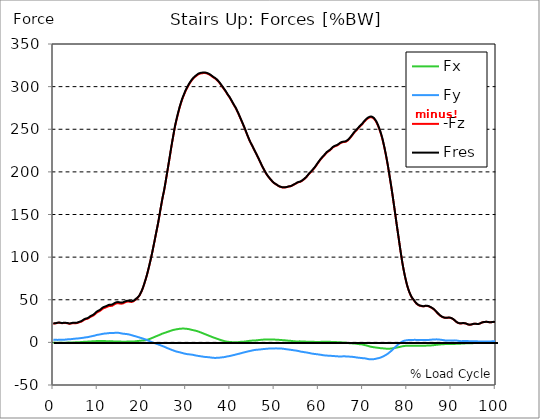
| Category |  Fx |  Fy |  -Fz |  Fres |
|---|---|---|---|---|
| 0.0 | -0.345 | 3.009 | 22.266 | 22.483 |
| 0.167348456675344 | -0.381 | 2.964 | 22.252 | 22.463 |
| 0.334696913350688 | -0.391 | 2.935 | 22.214 | 22.423 |
| 0.5020453700260321 | -0.388 | 2.917 | 22.174 | 22.381 |
| 0.669393826701376 | -0.377 | 2.942 | 22.462 | 22.668 |
| 0.83674228337672 | -0.383 | 2.92 | 22.723 | 22.926 |
| 1.0040907400520642 | -0.387 | 2.921 | 22.924 | 23.129 |
| 1.1621420602454444 | -0.378 | 2.964 | 23.04 | 23.249 |
| 1.3294905169207885 | -0.373 | 2.997 | 23.046 | 23.259 |
| 1.4968389735961325 | -0.39 | 3.006 | 22.915 | 23.129 |
| 1.6641874302714765 | -0.436 | 2.981 | 22.716 | 22.929 |
| 1.8315358869468206 | -0.488 | 2.938 | 22.507 | 22.717 |
| 1.9988843436221646 | -0.495 | 2.937 | 22.483 | 22.694 |
| 2.1662328002975086 | -0.484 | 3.004 | 22.606 | 22.827 |
| 2.333581256972853 | -0.474 | 3.076 | 22.739 | 22.97 |
| 2.5009297136481967 | -0.439 | 3.152 | 22.83 | 23.071 |
| 2.6682781703235405 | -0.414 | 3.228 | 22.769 | 23.021 |
| 2.8356266269988843 | -0.375 | 3.324 | 22.685 | 22.951 |
| 3.002975083674229 | -0.333 | 3.43 | 22.551 | 22.827 |
| 3.1703235403495724 | -0.27 | 3.57 | 22.457 | 22.752 |
| 3.337671997024917 | -0.263 | 3.6 | 22.237 | 22.542 |
| 3.4957233172182973 | -0.276 | 3.606 | 21.965 | 22.272 |
| 3.663071773893641 | -0.279 | 3.634 | 21.788 | 22.102 |
| 3.8304202305689854 | -0.244 | 3.702 | 21.933 | 22.257 |
| 3.997768687244329 | -0.209 | 3.775 | 22.174 | 22.507 |
| 4.165117143919673 | -0.172 | 3.858 | 22.394 | 22.737 |
| 4.332465600595017 | -0.13 | 3.969 | 22.555 | 22.914 |
| 4.499814057270361 | -0.089 | 4.081 | 22.632 | 23.009 |
| 4.667162513945706 | -0.058 | 4.228 | 22.581 | 22.986 |
| 4.834510970621049 | -0.028 | 4.324 | 22.489 | 22.916 |
| 5.001859427296393 | 0.001 | 4.391 | 22.421 | 22.863 |
| 5.169207883971737 | 0.031 | 4.466 | 22.499 | 22.954 |
| 5.336556340647081 | 0.061 | 4.498 | 22.641 | 23.099 |
| 5.503904797322425 | 0.092 | 4.551 | 22.884 | 23.347 |
| 5.671253253997769 | 0.152 | 4.675 | 23.232 | 23.714 |
| 5.82930457419115 | 0.225 | 4.809 | 23.608 | 24.107 |
| 5.996653030866494 | 0.275 | 4.907 | 23.839 | 24.352 |
| 6.164001487541838 | 0.32 | 5.003 | 24.043 | 24.569 |
| 6.331349944217181 | 0.368 | 5.094 | 24.368 | 24.906 |
| 6.498698400892526 | 0.453 | 5.191 | 24.923 | 25.47 |
| 6.66604685756787 | 0.543 | 5.323 | 25.523 | 26.084 |
| 6.833395314243213 | 0.634 | 5.454 | 26.106 | 26.685 |
| 7.000743770918558 | 0.72 | 5.615 | 26.632 | 27.235 |
| 7.168092227593902 | 0.783 | 5.772 | 27.017 | 27.645 |
| 7.335440684269246 | 0.817 | 5.894 | 27.255 | 27.906 |
| 7.50278914094459 | 0.837 | 5.978 | 27.432 | 28.095 |
| 7.6701375976199335 | 0.858 | 6.065 | 27.634 | 28.312 |
| 7.837486054295278 | 0.903 | 6.201 | 28.009 | 28.71 |
| 7.995537374488658 | 0.96 | 6.377 | 28.515 | 29.245 |
| 8.162885831164003 | 1.014 | 6.579 | 29.12 | 29.881 |
| 8.330234287839346 | 1.108 | 6.832 | 29.8 | 30.601 |
| 8.49758274451469 | 1.166 | 7.045 | 30.292 | 31.129 |
| 8.664931201190035 | 1.182 | 7.209 | 30.643 | 31.51 |
| 8.832279657865378 | 1.194 | 7.361 | 30.973 | 31.866 |
| 8.999628114540721 | 1.225 | 7.528 | 31.401 | 32.323 |
| 9.166976571216066 | 1.281 | 7.706 | 31.986 | 32.934 |
| 9.334325027891412 | 1.355 | 7.954 | 32.755 | 33.742 |
| 9.501673484566755 | 1.431 | 8.228 | 33.588 | 34.618 |
| 9.669021941242098 | 1.492 | 8.479 | 34.372 | 35.44 |
| 9.836370397917442 | 1.525 | 8.698 | 35.027 | 36.13 |
| 10.003718854592787 | 1.554 | 8.893 | 35.565 | 36.699 |
| 10.17106731126813 | 1.555 | 9.022 | 35.965 | 37.119 |
| 10.329118631461512 | 1.534 | 9.138 | 36.372 | 37.541 |
| 10.496467088136853 | 1.52 | 9.267 | 36.831 | 38.018 |
| 10.663815544812199 | 1.503 | 9.437 | 37.44 | 38.649 |
| 10.831164001487544 | 1.506 | 9.627 | 38.151 | 39.383 |
| 10.998512458162887 | 1.523 | 9.821 | 38.917 | 40.175 |
| 11.16586091483823 | 1.543 | 10.01 | 39.627 | 40.91 |
| 11.333209371513574 | 1.56 | 10.169 | 40.114 | 41.421 |
| 11.50055782818892 | 1.555 | 10.303 | 40.481 | 41.81 |
| 11.667906284864264 | 1.502 | 10.378 | 40.643 | 41.982 |
| 11.835254741539607 | 1.449 | 10.436 | 40.855 | 42.201 |
| 12.00260319821495 | 1.423 | 10.511 | 41.324 | 42.672 |
| 12.169951654890292 | 1.417 | 10.594 | 41.781 | 43.135 |
| 12.337300111565641 | 1.435 | 10.714 | 42.181 | 43.552 |
| 12.504648568240984 | 1.455 | 10.831 | 42.55 | 43.938 |
| 12.662699888434362 | 1.467 | 10.916 | 42.729 | 44.133 |
| 12.830048345109708 | 1.437 | 10.948 | 42.795 | 44.203 |
| 12.997396801785053 | 1.364 | 10.917 | 42.754 | 44.152 |
| 13.164745258460396 | 1.279 | 10.875 | 42.741 | 44.125 |
| 13.33209371513574 | 1.223 | 10.912 | 43.052 | 44.434 |
| 13.499442171811083 | 1.17 | 10.975 | 43.511 | 44.893 |
| 13.666790628486426 | 1.128 | 11.062 | 44.154 | 45.535 |
| 13.834139085161771 | 1.108 | 11.169 | 44.738 | 46.128 |
| 14.001487541837117 | 1.083 | 11.237 | 45.19 | 46.582 |
| 14.16883599851246 | 1.066 | 11.288 | 45.547 | 46.939 |
| 14.336184455187803 | 1.074 | 11.323 | 45.783 | 47.177 |
| 14.503532911863147 | 1.088 | 11.308 | 45.893 | 47.28 |
| 14.670881368538492 | 1.076 | 11.241 | 45.874 | 47.245 |
| 14.828932688731873 | 1.043 | 11.126 | 45.77 | 47.117 |
| 14.996281145407215 | 0.997 | 10.974 | 45.575 | 46.892 |
| 15.163629602082558 | 0.946 | 10.785 | 45.418 | 46.695 |
| 15.330978058757903 | 0.888 | 10.591 | 45.385 | 46.619 |
| 15.498326515433247 | 0.832 | 10.414 | 45.43 | 46.625 |
| 15.665674972108594 | 0.785 | 10.259 | 45.555 | 46.712 |
| 15.833023428783937 | 0.782 | 10.143 | 45.954 | 47.079 |
| 16.00037188545928 | 0.774 | 10.052 | 46.412 | 47.51 |
| 16.167720342134626 | 0.781 | 9.96 | 46.858 | 47.929 |
| 16.335068798809967 | 0.818 | 9.894 | 47.27 | 48.32 |
| 16.502417255485312 | 0.865 | 9.797 | 47.59 | 48.617 |
| 16.669765712160658 | 0.906 | 9.692 | 47.774 | 48.779 |
| 16.837114168836 | 0.968 | 9.575 | 47.868 | 48.85 |
| 17.004462625511344 | 1.006 | 9.422 | 47.872 | 48.826 |
| 17.16251394570472 | 1.027 | 9.231 | 47.775 | 48.695 |
| 17.32986240238007 | 0.997 | 9.004 | 47.572 | 48.449 |
| 17.497210859055414 | 0.964 | 8.746 | 47.419 | 48.248 |
| 17.664559315730756 | 0.977 | 8.483 | 47.443 | 48.222 |
| 17.8319077724061 | 0.999 | 8.21 | 47.581 | 48.31 |
| 17.999256229081443 | 1.031 | 7.939 | 47.915 | 48.596 |
| 18.166604685756788 | 1.068 | 7.679 | 48.387 | 49.022 |
| 18.333953142432133 | 1.106 | 7.432 | 48.988 | 49.578 |
| 18.501301599107478 | 1.182 | 7.206 | 49.742 | 50.293 |
| 18.668650055782823 | 1.311 | 7.031 | 50.573 | 51.088 |
| 18.835998512458165 | 1.445 | 6.737 | 51.21 | 51.683 |
| 19.00334696913351 | 1.573 | 6.436 | 51.907 | 52.342 |
| 19.170695425808855 | 1.681 | 6.173 | 52.812 | 53.213 |
| 19.338043882484197 | 1.75 | 5.92 | 53.961 | 54.33 |
| 19.496095202677576 | 1.81 | 5.655 | 55.255 | 55.59 |
| 19.66344365935292 | 1.906 | 5.405 | 56.822 | 57.126 |
| 19.830792116028263 | 2.004 | 5.145 | 58.622 | 58.899 |
| 19.998140572703612 | 2.11 | 4.893 | 60.563 | 60.817 |
| 20.165489029378953 | 2.205 | 4.639 | 62.725 | 62.955 |
| 20.3328374860543 | 2.289 | 4.346 | 65.152 | 65.359 |
| 20.500185942729644 | 2.395 | 4.049 | 67.781 | 67.964 |
| 20.667534399404985 | 2.525 | 3.746 | 70.535 | 70.703 |
| 20.83488285608033 | 2.663 | 3.428 | 73.307 | 73.461 |
| 21.002231312755672 | 2.822 | 3.092 | 76.145 | 76.284 |
| 21.16957976943102 | 3.04 | 2.745 | 79.315 | 79.446 |
| 21.336928226106362 | 3.268 | 2.387 | 82.596 | 82.72 |
| 21.504276682781704 | 3.519 | 2.015 | 86.032 | 86.15 |
| 21.67162513945705 | 3.813 | 1.637 | 89.694 | 89.813 |
| 21.82967645965043 | 4.134 | 1.253 | 93.365 | 93.488 |
| 21.997024916325774 | 4.458 | 0.868 | 97.057 | 97.186 |
| 22.16437337300112 | 4.787 | 0.49 | 100.872 | 101.008 |
| 22.33172182967646 | 5.146 | 0.129 | 104.902 | 105.049 |
| 22.499070286351806 | 5.52 | -0.195 | 109.133 | 109.292 |
| 22.666418743027148 | 5.885 | -0.499 | 113.43 | 113.604 |
| 22.833767199702496 | 6.254 | -0.779 | 117.626 | 117.814 |
| 23.00111565637784 | 6.637 | -1.077 | 121.978 | 122.183 |
| 23.168464113053183 | 7.015 | -1.394 | 126.409 | 126.628 |
| 23.335812569728528 | 7.373 | -1.684 | 130.748 | 130.985 |
| 23.50316102640387 | 7.701 | -2.003 | 135.119 | 135.369 |
| 23.670509483079215 | 8.026 | -2.329 | 139.401 | 139.667 |
| 23.83785793975456 | 8.396 | -2.637 | 144.243 | 144.526 |
| 23.995909259947936 | 8.752 | -2.938 | 149.234 | 149.533 |
| 24.163257716623285 | 9.173 | -3.284 | 154.326 | 154.648 |
| 24.330606173298627 | 9.559 | -3.617 | 159.219 | 159.56 |
| 24.49795462997397 | 9.945 | -3.957 | 164.055 | 164.415 |
| 24.665303086649313 | 10.323 | -4.293 | 168.794 | 169.175 |
| 24.83265154332466 | 10.613 | -4.612 | 173.004 | 173.401 |
| 25.0 | 10.872 | -4.925 | 176.977 | 177.391 |
| 25.167348456675345 | 11.164 | -5.317 | 181.721 | 182.154 |
| 25.334696913350694 | 11.455 | -5.721 | 186.674 | 187.124 |
| 25.502045370026035 | 11.764 | -6.138 | 191.852 | 192.321 |
| 25.669393826701377 | 12.061 | -6.524 | 197.014 | 197.502 |
| 25.836742283376722 | 12.35 | -6.88 | 202.206 | 202.711 |
| 26.004090740052067 | 12.64 | -7.23 | 207.45 | 207.973 |
| 26.17143919672741 | 12.937 | -7.581 | 212.728 | 213.267 |
| 26.329490516920792 | 13.237 | -7.921 | 218.013 | 218.57 |
| 26.49683897359613 | 13.547 | -8.272 | 223.44 | 224.014 |
| 26.66418743027148 | 13.844 | -8.591 | 228.705 | 229.295 |
| 26.831535886946828 | 14.121 | -8.911 | 233.839 | 234.445 |
| 26.998884343622166 | 14.378 | -9.241 | 238.752 | 239.373 |
| 27.166232800297514 | 14.625 | -9.569 | 243.606 | 244.243 |
| 27.333581256972852 | 14.832 | -9.892 | 248.443 | 249.09 |
| 27.5009297136482 | 15.003 | -10.196 | 253.046 | 253.705 |
| 27.668278170323543 | 15.161 | -10.493 | 256.996 | 257.666 |
| 27.835626626998888 | 15.288 | -10.778 | 260.774 | 261.453 |
| 28.002975083674233 | 15.452 | -11.013 | 264.394 | 265.081 |
| 28.170323540349575 | 15.605 | -11.181 | 267.839 | 268.534 |
| 28.33767199702492 | 15.76 | -11.347 | 271.217 | 271.919 |
| 28.50502045370026 | 15.917 | -11.548 | 274.477 | 275.19 |
| 28.663071773893645 | 16.032 | -11.769 | 277.521 | 278.241 |
| 28.830420230568986 | 16.086 | -11.995 | 280.323 | 281.048 |
| 28.99776868724433 | 16.12 | -12.221 | 283.017 | 283.748 |
| 29.165117143919673 | 16.165 | -12.475 | 285.551 | 286.289 |
| 29.33246560059502 | 16.179 | -12.72 | 287.839 | 288.582 |
| 29.499814057270367 | 16.143 | -12.93 | 289.926 | 290.672 |
| 29.66716251394571 | 16.121 | -13.17 | 292.105 | 292.854 |
| 29.834510970621054 | 16.097 | -13.396 | 294.166 | 294.92 |
| 30.00185942729639 | 16.022 | -13.557 | 296.026 | 296.779 |
| 30.169207883971744 | 15.89 | -13.693 | 297.708 | 298.457 |
| 30.33655634064708 | 15.772 | -13.831 | 299.361 | 300.107 |
| 30.50390479732243 | 15.667 | -13.924 | 300.963 | 301.703 |
| 30.671253253997772 | 15.495 | -14.017 | 302.516 | 303.25 |
| 30.829304574191156 | 15.28 | -14.105 | 303.925 | 304.649 |
| 30.996653030866494 | 15.067 | -14.209 | 305.241 | 305.956 |
| 31.164001487541842 | 14.857 | -14.32 | 306.485 | 307.194 |
| 31.331349944217187 | 14.645 | -14.432 | 307.671 | 308.372 |
| 31.498698400892525 | 14.449 | -14.573 | 308.766 | 309.463 |
| 31.666046857567874 | 14.263 | -14.746 | 309.733 | 310.427 |
| 31.833395314243212 | 14.092 | -14.95 | 310.568 | 311.263 |
| 32.00074377091856 | 13.915 | -15.148 | 311.337 | 312.035 |
| 32.1680922275939 | 13.69 | -15.345 | 312.046 | 312.743 |
| 32.33544068426925 | 13.448 | -15.511 | 312.741 | 313.435 |
| 32.50278914094459 | 13.203 | -15.672 | 313.436 | 314.126 |
| 32.670137597619934 | 12.92 | -15.817 | 314.098 | 314.782 |
| 32.83748605429528 | 12.579 | -15.929 | 314.605 | 315.281 |
| 33.004834510970625 | 12.281 | -16.074 | 315.015 | 315.686 |
| 33.162885831164004 | 11.99 | -16.243 | 315.293 | 315.961 |
| 33.33023428783935 | 11.662 | -16.35 | 315.489 | 316.151 |
| 33.497582744514695 | 11.319 | -16.43 | 315.658 | 316.311 |
| 33.664931201190036 | 10.965 | -16.591 | 315.764 | 316.414 |
| 33.83227965786538 | 10.609 | -16.754 | 315.855 | 316.506 |
| 33.99962811454073 | 10.257 | -16.895 | 315.914 | 316.559 |
| 34.16697657121607 | 9.91 | -17.044 | 315.939 | 316.582 |
| 34.33432502789141 | 9.568 | -17.13 | 315.912 | 316.548 |
| 34.50167348456676 | 9.223 | -17.178 | 315.765 | 316.395 |
| 34.6690219412421 | 8.894 | -17.277 | 315.502 | 316.128 |
| 34.83637039791744 | 8.547 | -17.314 | 315.218 | 315.834 |
| 35.00371885459279 | 8.175 | -17.333 | 314.854 | 315.462 |
| 35.17106731126814 | 7.852 | -17.415 | 314.436 | 315.041 |
| 35.338415767943474 | 7.505 | -17.548 | 313.951 | 314.556 |
| 35.49646708813686 | 7.186 | -17.674 | 313.392 | 313.997 |
| 35.6638155448122 | 6.797 | -17.794 | 312.803 | 313.408 |
| 35.831164001487544 | 6.425 | -17.897 | 312.179 | 312.783 |
| 35.998512458162885 | 6.108 | -18.037 | 311.459 | 312.07 |
| 36.165860914838234 | 5.806 | -18.121 | 310.792 | 311.403 |
| 36.333209371513576 | 5.499 | -18.173 | 310.263 | 310.872 |
| 36.50055782818892 | 5.201 | -18.21 | 309.756 | 310.363 |
| 36.667906284864266 | 4.916 | -18.232 | 309.177 | 309.781 |
| 36.83525474153961 | 4.618 | -18.197 | 308.445 | 309.045 |
| 37.002603198214956 | 4.257 | -18.117 | 307.662 | 308.253 |
| 37.1699516548903 | 3.956 | -18.062 | 306.823 | 307.409 |
| 37.337300111565646 | 3.65 | -17.99 | 305.849 | 306.428 |
| 37.50464856824098 | 3.352 | -17.945 | 304.779 | 305.355 |
| 37.66269988843437 | 3.031 | -17.876 | 303.679 | 304.248 |
| 37.83004834510971 | 2.76 | -17.752 | 302.514 | 303.075 |
| 37.99739680178505 | 2.517 | -17.643 | 301.312 | 301.867 |
| 38.16474525846039 | 2.266 | -17.55 | 300.055 | 300.604 |
| 38.33209371513574 | 2 | -17.465 | 298.839 | 299.382 |
| 38.49944217181109 | 1.703 | -17.386 | 297.631 | 298.169 |
| 38.666790628486424 | 1.44 | -17.243 | 296.45 | 296.982 |
| 38.83413908516178 | 1.187 | -17.062 | 295.323 | 295.845 |
| 39.001487541837115 | 1.019 | -16.861 | 293.986 | 294.498 |
| 39.16883599851246 | 0.853 | -16.625 | 292.603 | 293.103 |
| 39.336184455187805 | 0.786 | -16.45 | 291.126 | 291.619 |
| 39.503532911863154 | 0.667 | -16.317 | 289.825 | 290.312 |
| 39.670881368538495 | 0.552 | -16.212 | 288.635 | 289.119 |
| 39.83822982521384 | 0.461 | -16.072 | 287.354 | 287.832 |
| 39.996281145407224 | 0.409 | -15.876 | 285.917 | 286.388 |
| 40.163629602082565 | 0.373 | -15.695 | 284.392 | 284.855 |
| 40.33097805875791 | 0.308 | -15.436 | 282.895 | 283.348 |
| 40.498326515433256 | 0.237 | -15.213 | 281.335 | 281.778 |
| 40.6656749721086 | 0.174 | -15.023 | 279.795 | 280.23 |
| 40.83302342878393 | 0.138 | -14.837 | 278.244 | 278.67 |
| 41.00037188545929 | 0.123 | -14.619 | 276.8 | 277.217 |
| 41.16772034213463 | 0.125 | -14.383 | 275.443 | 275.849 |
| 41.33506879880997 | 0.146 | -14.123 | 273.772 | 274.165 |
| 41.50241725548531 | 0.182 | -13.899 | 271.973 | 272.357 |
| 41.66976571216066 | 0.21 | -13.717 | 270.155 | 270.533 |
| 41.837114168836 | 0.266 | -13.525 | 268.317 | 268.688 |
| 42.004462625511344 | 0.39 | -13.314 | 266.342 | 266.706 |
| 42.17181108218669 | 0.525 | -13.098 | 264.348 | 264.703 |
| 42.32986240238007 | 0.643 | -12.868 | 262.323 | 262.668 |
| 42.497210859055414 | 0.714 | -12.625 | 260.306 | 260.641 |
| 42.66455931573076 | 0.754 | -12.369 | 258.31 | 258.635 |
| 42.831907772406105 | 0.786 | -12.124 | 256.33 | 256.646 |
| 42.999256229081446 | 0.828 | -11.905 | 254.254 | 254.563 |
| 43.16660468575679 | 0.875 | -11.676 | 252.143 | 252.443 |
| 43.33395314243214 | 0.963 | -11.459 | 249.994 | 250.285 |
| 43.50130159910748 | 1.081 | -11.249 | 247.813 | 248.098 |
| 43.66865005578282 | 1.244 | -11.043 | 245.517 | 245.795 |
| 43.83599851245817 | 1.41 | -10.839 | 243.325 | 243.597 |
| 44.00334696913351 | 1.545 | -10.627 | 241.199 | 241.463 |
| 44.17069542580886 | 1.652 | -10.415 | 239.105 | 239.364 |
| 44.3380438824842 | 1.773 | -10.23 | 237.05 | 237.305 |
| 44.49609520267758 | 1.924 | -10.052 | 235.119 | 235.369 |
| 44.66344365935292 | 2.027 | -9.88 | 233.383 | 233.63 |
| 44.83079211602827 | 2.063 | -9.683 | 231.837 | 232.079 |
| 44.99814057270361 | 2.065 | -9.461 | 230.231 | 230.465 |
| 45.16548902937895 | 2.092 | -9.261 | 228.441 | 228.668 |
| 45.332837486054295 | 2.115 | -9.094 | 226.658 | 226.88 |
| 45.500185942729644 | 2.142 | -8.948 | 224.915 | 225.133 |
| 45.66753439940499 | 2.212 | -8.832 | 223.231 | 223.448 |
| 45.83488285608033 | 2.325 | -8.747 | 221.585 | 221.801 |
| 46.00223131275568 | 2.441 | -8.67 | 219.843 | 220.059 |
| 46.16957976943102 | 2.555 | -8.597 | 218.031 | 218.249 |
| 46.336928226106366 | 2.643 | -8.499 | 216.221 | 216.437 |
| 46.50427668278171 | 2.733 | -8.419 | 214.422 | 214.636 |
| 46.671625139457056 | 2.828 | -8.328 | 212.599 | 212.813 |
| 46.829676459650436 | 2.928 | -8.246 | 210.781 | 210.994 |
| 46.99702491632577 | 3.034 | -8.147 | 208.884 | 209.095 |
| 47.16437337300112 | 3.106 | -8.044 | 207.085 | 207.294 |
| 47.33172182967646 | 3.168 | -7.928 | 205.379 | 205.586 |
| 47.49907028635181 | 3.228 | -7.863 | 203.737 | 203.941 |
| 47.66641874302716 | 3.303 | -7.806 | 202.141 | 202.345 |
| 47.83376719970249 | 3.366 | -7.712 | 200.563 | 200.765 |
| 48.001115656377834 | 3.419 | -7.608 | 198.985 | 199.185 |
| 48.16846411305319 | 3.453 | -7.521 | 197.529 | 197.726 |
| 48.33581256972853 | 3.453 | -7.436 | 196.212 | 196.406 |
| 48.50316102640387 | 3.431 | -7.355 | 194.988 | 195.181 |
| 48.67050948307921 | 3.408 | -7.299 | 193.906 | 194.095 |
| 48.837857939754564 | 3.395 | -7.249 | 192.844 | 193.032 |
| 49.005206396429905 | 3.373 | -7.175 | 191.745 | 191.93 |
| 49.163257716623285 | 3.361 | -7.146 | 190.746 | 190.93 |
| 49.33060617329863 | 3.382 | -7.132 | 189.732 | 189.916 |
| 49.49795462997397 | 3.386 | -7.125 | 188.785 | 188.97 |
| 49.66530308664932 | 3.378 | -7.116 | 187.951 | 188.137 |
| 49.832651543324666 | 3.37 | -7.099 | 187.139 | 187.324 |
| 50.0 | 3.33 | -7.076 | 186.414 | 186.599 |
| 50.16734845667534 | 3.234 | -7.041 | 185.883 | 186.062 |
| 50.33469691335069 | 3.135 | -7.022 | 185.386 | 185.561 |
| 50.50204537002604 | 3.083 | -7.048 | 184.865 | 185.039 |
| 50.66939382670139 | 3.058 | -7.079 | 184.226 | 184.403 |
| 50.836742283376715 | 3.025 | -7.119 | 183.666 | 183.844 |
| 51.00409074005207 | 2.978 | -7.124 | 183.081 | 183.259 |
| 51.17143919672741 | 2.871 | -7.124 | 182.715 | 182.892 |
| 51.32949051692079 | 2.782 | -7.169 | 182.488 | 182.665 |
| 51.496838973596134 | 2.717 | -7.221 | 182.214 | 182.392 |
| 51.66418743027148 | 2.677 | -7.302 | 181.933 | 182.115 |
| 51.831535886946824 | 2.631 | -7.387 | 181.684 | 181.868 |
| 51.99888434362217 | 2.542 | -7.495 | 181.677 | 181.866 |
| 52.16623280029752 | 2.446 | -7.625 | 181.756 | 181.948 |
| 52.33358125697285 | 2.405 | -7.774 | 181.797 | 181.997 |
| 52.5009297136482 | 2.368 | -7.925 | 181.837 | 182.044 |
| 52.668278170323546 | 2.265 | -8.046 | 181.956 | 182.166 |
| 52.835626626998895 | 2.107 | -8.137 | 182.159 | 182.372 |
| 53.00297508367424 | 2.034 | -8.246 | 182.434 | 182.65 |
| 53.17032354034958 | 1.972 | -8.359 | 182.711 | 182.932 |
| 53.33767199702492 | 1.952 | -8.476 | 182.883 | 183.11 |
| 53.50502045370027 | 1.903 | -8.61 | 182.934 | 183.168 |
| 53.663071773893655 | 1.821 | -8.743 | 183.057 | 183.295 |
| 53.83042023056899 | 1.653 | -8.84 | 183.457 | 183.699 |
| 53.99776868724433 | 1.539 | -8.952 | 183.943 | 184.191 |
| 54.16511714391967 | 1.454 | -9.08 | 184.434 | 184.688 |
| 54.33246560059503 | 1.408 | -9.228 | 184.941 | 185.203 |
| 54.49981405727037 | 1.315 | -9.368 | 185.375 | 185.644 |
| 54.667162513945705 | 1.203 | -9.49 | 185.769 | 186.043 |
| 54.834510970621054 | 1.124 | -9.6 | 186.237 | 186.516 |
| 55.0018594272964 | 1.059 | -9.711 | 186.815 | 187.098 |
| 55.169207883971744 | 1.11 | -9.879 | 187.399 | 187.69 |
| 55.336556340647086 | 1.152 | -10.063 | 187.754 | 188.055 |
| 55.50390479732243 | 1.186 | -10.259 | 187.933 | 188.245 |
| 55.671253253997776 | 1.185 | -10.468 | 188.123 | 188.446 |
| 55.83860171067312 | 1.178 | -10.701 | 188.332 | 188.668 |
| 55.9966530308665 | 1.151 | -10.888 | 188.695 | 189.041 |
| 56.16400148754184 | 1.107 | -11.023 | 189.277 | 189.63 |
| 56.33134994421718 | 1.063 | -11.123 | 189.925 | 190.281 |
| 56.498698400892536 | 1.052 | -11.244 | 190.6 | 190.963 |
| 56.66604685756788 | 1.063 | -11.4 | 191.266 | 191.636 |
| 56.83339531424321 | 1.009 | -11.555 | 191.957 | 192.335 |
| 57.00074377091856 | 0.91 | -11.693 | 192.706 | 193.09 |
| 57.16809222759391 | 0.818 | -11.804 | 193.583 | 193.973 |
| 57.33544068426925 | 0.76 | -11.942 | 194.533 | 194.93 |
| 57.5027891409446 | 0.741 | -12.106 | 195.641 | 196.048 |
| 57.670137597619934 | 0.751 | -12.299 | 196.785 | 197.203 |
| 57.83748605429528 | 0.72 | -12.475 | 197.799 | 198.226 |
| 58.004834510970625 | 0.735 | -12.631 | 198.67 | 199.105 |
| 58.16288583116401 | 0.759 | -12.819 | 199.497 | 199.941 |
| 58.330234287839346 | 0.783 | -13.008 | 200.323 | 200.778 |
| 58.497582744514695 | 0.733 | -13.174 | 201.337 | 201.801 |
| 58.66493120119004 | 0.68 | -13.319 | 202.276 | 202.748 |
| 58.832279657865385 | 0.64 | -13.444 | 203.35 | 203.828 |
| 58.999628114540734 | 0.591 | -13.572 | 204.363 | 204.848 |
| 59.16697657121607 | 0.542 | -13.693 | 205.414 | 205.905 |
| 59.33432502789142 | 0.526 | -13.764 | 206.667 | 207.159 |
| 59.50167348456676 | 0.511 | -13.866 | 207.89 | 208.385 |
| 59.66902194124211 | 0.514 | -13.943 | 209.23 | 209.725 |
| 59.83637039791745 | 0.499 | -14.063 | 210.419 | 210.917 |
| 60.00371885459278 | 0.507 | -14.212 | 211.586 | 212.09 |
| 60.17106731126813 | 0.526 | -14.351 | 212.745 | 213.254 |
| 60.33841576794349 | 0.563 | -14.461 | 213.907 | 214.421 |
| 60.49646708813685 | 0.604 | -14.581 | 215.045 | 215.563 |
| 60.6638155448122 | 0.65 | -14.714 | 216.111 | 216.634 |
| 60.831164001487544 | 0.724 | -14.897 | 216.987 | 217.517 |
| 60.99851245816289 | 0.75 | -15.071 | 217.865 | 218.404 |
| 61.16586091483824 | 0.766 | -15.186 | 218.813 | 219.355 |
| 61.333209371513576 | 0.783 | -15.262 | 219.805 | 220.35 |
| 61.50055782818892 | 0.79 | -15.325 | 220.823 | 221.369 |
| 61.667906284864266 | 0.796 | -15.386 | 221.831 | 222.378 |
| 61.835254741539615 | 0.794 | -15.457 | 222.756 | 223.306 |
| 62.002603198214956 | 0.779 | -15.55 | 223.418 | 223.972 |
| 62.16995165489029 | 0.756 | -15.648 | 223.96 | 224.517 |
| 62.33730011156564 | 0.701 | -15.699 | 224.552 | 225.111 |
| 62.504648568240995 | 0.65 | -15.737 | 225.186 | 225.745 |
| 62.67199702491633 | 0.603 | -15.769 | 225.865 | 226.425 |
| 62.83004834510971 | 0.547 | -15.813 | 226.693 | 227.253 |
| 62.99739680178505 | 0.48 | -15.867 | 227.657 | 228.218 |
| 63.1647452584604 | 0.43 | -15.946 | 228.592 | 229.157 |
| 63.33209371513575 | 0.395 | -16.036 | 229.134 | 229.703 |
| 63.4994421718111 | 0.36 | -16.105 | 229.667 | 230.239 |
| 63.666790628486424 | 0.351 | -16.141 | 230 | 230.574 |
| 63.83413908516177 | 0.346 | -16.185 | 230.355 | 230.932 |
| 64.00148754183712 | 0.316 | -16.253 | 230.683 | 231.262 |
| 64.16883599851248 | 0.268 | -16.338 | 231.039 | 231.623 |
| 64.3361844551878 | 0.218 | -16.421 | 231.532 | 232.12 |
| 64.50353291186315 | 0.182 | -16.481 | 232.141 | 232.733 |
| 64.6708813685385 | 0.147 | -16.52 | 232.801 | 233.394 |
| 64.83822982521384 | 0.12 | -16.545 | 233.448 | 234.041 |
| 65.00557828188919 | 0.088 | -16.555 | 233.999 | 234.591 |
| 65.16362960208257 | -0.023 | -16.508 | 234.352 | 234.941 |
| 65.3309780587579 | -0.129 | -16.44 | 234.625 | 235.208 |
| 65.49832651543326 | -0.217 | -16.363 | 234.874 | 235.45 |
| 65.6656749721086 | -0.156 | -16.35 | 234.959 | 235.533 |
| 65.83302342878395 | -0.07 | -16.378 | 234.991 | 235.568 |
| 66.00037188545929 | -0.188 | -16.419 | 235.177 | 235.756 |
| 66.16772034213463 | -0.335 | -16.454 | 235.459 | 236.041 |
| 66.33506879880998 | -0.529 | -16.479 | 235.961 | 236.545 |
| 66.50241725548531 | -0.689 | -16.534 | 236.639 | 237.225 |
| 66.66976571216065 | -0.854 | -16.637 | 237.319 | 237.911 |
| 66.83711416883601 | -0.905 | -16.667 | 238.206 | 238.797 |
| 67.00446262551135 | -0.929 | -16.729 | 239.188 | 239.783 |
| 67.1718110821867 | -0.961 | -16.748 | 240.236 | 240.828 |
| 67.32986240238007 | -1.001 | -16.756 | 241.299 | 241.89 |
| 67.49721085905541 | -1.089 | -16.857 | 242.395 | 242.991 |
| 67.66455931573076 | -1.213 | -17.018 | 243.476 | 244.081 |
| 67.83190777240611 | -1.315 | -17.081 | 244.741 | 245.35 |
| 67.99925622908145 | -1.346 | -17.188 | 245.874 | 246.488 |
| 68.16660468575678 | -1.381 | -17.328 | 246.875 | 247.497 |
| 68.33395314243214 | -1.479 | -17.508 | 247.676 | 248.308 |
| 68.50130159910749 | -1.582 | -17.67 | 248.532 | 249.174 |
| 68.66865005578282 | -1.715 | -17.759 | 249.594 | 250.241 |
| 68.83599851245816 | -1.912 | -17.902 | 250.543 | 251.201 |
| 69.00334696913352 | -1.996 | -18.015 | 251.49 | 252.155 |
| 69.17069542580886 | -2.035 | -18.074 | 252.455 | 253.124 |
| 69.3380438824842 | -2.152 | -18.147 | 253.356 | 254.028 |
| 69.50539233915956 | -2.225 | -18.262 | 254.234 | 254.914 |
| 69.66344365935292 | -2.288 | -18.364 | 254.955 | 255.641 |
| 69.83079211602826 | -2.379 | -18.467 | 255.773 | 256.465 |
| 69.99814057270362 | -2.631 | -18.542 | 256.898 | 257.594 |
| 70.16548902937896 | -2.928 | -18.603 | 258.077 | 258.775 |
| 70.33283748605429 | -3.143 | -18.666 | 259.084 | 259.786 |
| 70.50018594272964 | -3.305 | -18.741 | 259.966 | 260.672 |
| 70.667534399405 | -3.479 | -18.915 | 260.791 | 261.507 |
| 70.83488285608033 | -3.714 | -19.151 | 261.657 | 262.388 |
| 71.00223131275568 | -3.952 | -19.369 | 262.399 | 263.146 |
| 71.16957976943102 | -4.199 | -19.566 | 263.01 | 263.773 |
| 71.33692822610637 | -4.457 | -19.697 | 263.495 | 264.271 |
| 71.50427668278171 | -4.729 | -19.761 | 263.858 | 264.641 |
| 71.67162513945706 | -4.981 | -19.814 | 264.151 | 264.942 |
| 71.8389735961324 | -5.155 | -19.826 | 264.163 | 264.957 |
| 71.99702491632577 | -5.302 | -19.854 | 263.975 | 264.775 |
| 72.16437337300113 | -5.459 | -19.865 | 263.63 | 264.435 |
| 72.33172182967647 | -5.595 | -19.781 | 263.061 | 263.863 |
| 72.49907028635181 | -5.735 | -19.65 | 262.28 | 263.079 |
| 72.66641874302715 | -5.872 | -19.51 | 261.311 | 262.106 |
| 72.8337671997025 | -5.999 | -19.337 | 260.046 | 260.835 |
| 73.00111565637783 | -6.117 | -19.137 | 258.594 | 259.374 |
| 73.16846411305319 | -6.213 | -18.907 | 256.915 | 257.686 |
| 73.33581256972853 | -6.312 | -18.689 | 254.999 | 255.763 |
| 73.50316102640387 | -6.44 | -18.514 | 252.863 | 253.623 |
| 73.67050948307921 | -6.573 | -18.329 | 250.654 | 251.412 |
| 73.83785793975457 | -6.71 | -18.098 | 248.293 | 249.044 |
| 74.00520639642991 | -6.814 | -17.785 | 245.637 | 246.377 |
| 74.16325771662328 | -6.889 | -17.419 | 242.786 | 243.51 |
| 74.33060617329863 | -6.951 | -17.027 | 239.697 | 240.404 |
| 74.49795462997398 | -6.995 | -16.609 | 236.248 | 236.937 |
| 74.66530308664932 | -7.071 | -16.188 | 232.492 | 233.165 |
| 74.83265154332466 | -7.152 | -15.757 | 228.595 | 229.252 |
| 75.00000000000001 | -7.248 | -15.292 | 224.495 | 225.137 |
| 75.16734845667534 | -7.335 | -14.804 | 220.199 | 220.822 |
| 75.3346969133507 | -7.427 | -14.286 | 215.667 | 216.272 |
| 75.50204537002605 | -7.499 | -13.743 | 210.982 | 211.568 |
| 75.66939382670138 | -7.52 | -13.129 | 206.035 | 206.595 |
| 75.83674228337672 | -7.476 | -12.426 | 200.757 | 201.286 |
| 76.00409074005208 | -7.41 | -11.693 | 195.392 | 195.889 |
| 76.17143919672742 | -7.332 | -10.983 | 190.013 | 190.48 |
| 76.33878765340276 | -7.249 | -10.28 | 184.663 | 185.098 |
| 76.49683897359614 | -7.135 | -9.517 | 179.102 | 179.505 |
| 76.66418743027148 | -7.009 | -8.716 | 173.315 | 173.683 |
| 76.83153588694682 | -6.877 | -7.897 | 167.326 | 167.663 |
| 76.99888434362218 | -6.719 | -7.044 | 161.221 | 161.525 |
| 77.16623280029752 | -6.563 | -6.203 | 155.223 | 155.493 |
| 77.33358125697285 | -6.395 | -5.397 | 149.09 | 149.335 |
| 77.5009297136482 | -6.221 | -4.59 | 142.901 | 143.121 |
| 77.66827817032356 | -6.045 | -3.795 | 136.809 | 137.005 |
| 77.83562662699889 | -5.874 | -3.03 | 130.857 | 131.035 |
| 78.00297508367423 | -5.688 | -2.301 | 124.91 | 125.074 |
| 78.17032354034959 | -5.492 | -1.591 | 118.966 | 119.117 |
| 78.33767199702493 | -5.293 | -0.876 | 112.914 | 113.053 |
| 78.50502045370027 | -5.072 | -0.23 | 106.972 | 107.106 |
| 78.67236891037561 | -4.859 | 0.356 | 101.241 | 101.373 |
| 78.83042023056899 | -4.683 | 0.867 | 95.806 | 95.937 |
| 78.99776868724433 | -4.53 | 1.307 | 90.643 | 90.774 |
| 79.16511714391969 | -4.388 | 1.64 | 85.93 | 86.067 |
| 79.33246560059503 | -4.257 | 1.923 | 81.501 | 81.644 |
| 79.49981405727036 | -4.142 | 2.15 | 77.435 | 77.585 |
| 79.66716251394571 | -4.04 | 2.297 | 73.621 | 73.777 |
| 79.83451097062107 | -3.946 | 2.432 | 69.948 | 70.111 |
| 80.00185942729641 | -3.88 | 2.557 | 66.617 | 66.79 |
| 80.16920788397174 | -3.848 | 2.671 | 63.701 | 63.884 |
| 80.33655634064709 | -3.834 | 2.737 | 61.102 | 61.295 |
| 80.50390479732243 | -3.834 | 2.765 | 58.724 | 58.925 |
| 80.67125325399778 | -3.845 | 2.778 | 56.657 | 56.866 |
| 80.83860171067312 | -3.845 | 2.794 | 54.765 | 54.981 |
| 80.99665303086651 | -3.854 | 2.79 | 53.099 | 53.32 |
| 81.16400148754184 | -3.88 | 2.79 | 51.689 | 51.917 |
| 81.3313499442172 | -3.923 | 2.845 | 50.606 | 50.845 |
| 81.49869840089255 | -3.928 | 2.948 | 49.524 | 49.774 |
| 81.66604685756786 | -3.88 | 2.986 | 48.301 | 48.559 |
| 81.83339531424322 | -3.854 | 2.959 | 47.067 | 47.329 |
| 82.00074377091858 | -3.862 | 2.903 | 45.969 | 46.234 |
| 82.16809222759392 | -3.857 | 2.844 | 45.134 | 45.399 |
| 82.33544068426926 | -3.836 | 2.804 | 44.448 | 44.71 |
| 82.50278914094459 | -3.831 | 2.823 | 43.895 | 44.16 |
| 82.67013759761994 | -3.845 | 2.804 | 43.432 | 43.698 |
| 82.83748605429528 | -3.868 | 2.76 | 43.041 | 43.308 |
| 83.00483451097062 | -3.898 | 2.672 | 42.751 | 43.017 |
| 83.17218296764597 | -3.923 | 2.654 | 42.659 | 42.926 |
| 83.33023428783935 | -3.926 | 2.699 | 42.609 | 42.88 |
| 83.4975827445147 | -3.866 | 2.686 | 42.249 | 42.514 |
| 83.66493120119004 | -3.867 | 2.663 | 42.174 | 42.439 |
| 83.83227965786537 | -3.849 | 2.644 | 42.239 | 42.499 |
| 83.99962811454073 | -3.853 | 2.659 | 42.564 | 42.826 |
| 84.16697657121607 | -3.853 | 2.692 | 42.835 | 43.095 |
| 84.33432502789142 | -3.817 | 2.742 | 42.787 | 43.049 |
| 84.50167348456677 | -3.795 | 2.763 | 42.698 | 42.96 |
| 84.6690219412421 | -3.787 | 2.772 | 42.582 | 42.845 |
| 84.83637039791745 | -3.763 | 2.834 | 42.315 | 42.582 |
| 85.0037188545928 | -3.73 | 2.919 | 41.947 | 42.219 |
| 85.17106731126813 | -3.674 | 2.995 | 41.561 | 41.836 |
| 85.33841576794349 | -3.608 | 3.102 | 41.111 | 41.392 |
| 85.50576422461883 | -3.53 | 3.223 | 40.603 | 40.89 |
| 85.66381554481221 | -3.443 | 3.289 | 40.089 | 40.378 |
| 85.83116400148755 | -3.352 | 3.359 | 39.532 | 39.822 |
| 85.99851245816289 | -3.259 | 3.436 | 38.859 | 39.154 |
| 86.16586091483823 | -3.156 | 3.475 | 38.085 | 38.381 |
| 86.33320937151358 | -3.048 | 3.505 | 37.234 | 37.532 |
| 86.50055782818893 | -2.937 | 3.528 | 36.231 | 36.533 |
| 86.66790628486427 | -2.834 | 3.525 | 35.221 | 35.525 |
| 86.83525474153961 | -2.745 | 3.465 | 34.423 | 34.719 |
| 87.00260319821496 | -2.661 | 3.418 | 33.599 | 33.89 |
| 87.16995165489031 | -2.585 | 3.346 | 32.694 | 32.981 |
| 87.33730011156564 | -2.506 | 3.245 | 31.915 | 32.191 |
| 87.504648568241 | -2.41 | 3.148 | 31.235 | 31.498 |
| 87.67199702491634 | -2.307 | 3.044 | 30.594 | 30.843 |
| 87.83004834510972 | -2.222 | 2.903 | 30.055 | 30.289 |
| 87.99739680178506 | -2.159 | 2.772 | 29.619 | 29.837 |
| 88.1647452584604 | -2.111 | 2.613 | 29.29 | 29.492 |
| 88.33209371513574 | -2.066 | 2.507 | 28.995 | 29.183 |
| 88.49944217181108 | -2.039 | 2.368 | 28.834 | 29.009 |
| 88.66679062848644 | -2.026 | 2.265 | 28.769 | 28.935 |
| 88.83413908516178 | -2.022 | 2.206 | 28.741 | 28.902 |
| 89.00148754183712 | -1.999 | 2.15 | 28.783 | 28.938 |
| 89.16883599851246 | -1.997 | 2.107 | 28.876 | 29.028 |
| 89.33618445518782 | -2.003 | 2.065 | 28.979 | 29.128 |
| 89.50353291186315 | -2.025 | 2.068 | 28.975 | 29.125 |
| 89.6708813685385 | -2.039 | 2.101 | 28.893 | 29.046 |
| 89.83822982521386 | -2.041 | 2.154 | 28.694 | 28.852 |
| 90.00557828188919 | -2.004 | 2.213 | 28.308 | 28.471 |
| 90.16362960208257 | -1.951 | 2.262 | 27.876 | 28.041 |
| 90.3309780587579 | -1.899 | 2.307 | 27.399 | 27.566 |
| 90.49832651543326 | -1.854 | 2.345 | 26.848 | 27.019 |
| 90.66567497210859 | -1.817 | 2.35 | 26.135 | 26.31 |
| 90.83302342878395 | -1.79 | 2.33 | 25.305 | 25.479 |
| 91.00037188545929 | -1.747 | 2.288 | 24.477 | 24.652 |
| 91.16772034213463 | -1.712 | 2.201 | 23.806 | 23.975 |
| 91.33506879880998 | -1.681 | 2.036 | 23.311 | 23.468 |
| 91.50241725548533 | -1.649 | 1.87 | 22.827 | 22.97 |
| 91.66976571216065 | -1.61 | 1.712 | 22.483 | 22.613 |
| 91.83711416883601 | -1.57 | 1.581 | 22.302 | 22.422 |
| 92.00446262551137 | -1.528 | 1.48 | 22.192 | 22.302 |
| 92.1718110821867 | -1.479 | 1.439 | 22.188 | 22.293 |
| 92.33915953886203 | -1.418 | 1.443 | 22.348 | 22.448 |
| 92.49721085905541 | -1.348 | 1.461 | 22.534 | 22.632 |
| 92.66455931573077 | -1.295 | 1.519 | 22.538 | 22.64 |
| 92.83190777240611 | -1.241 | 1.575 | 22.494 | 22.599 |
| 92.99925622908145 | -1.194 | 1.604 | 22.419 | 22.523 |
| 93.1666046857568 | -1.159 | 1.631 | 22.258 | 22.363 |
| 93.33395314243214 | -1.137 | 1.648 | 21.982 | 22.088 |
| 93.50130159910749 | -1.114 | 1.603 | 21.603 | 21.706 |
| 93.66865005578283 | -1.101 | 1.555 | 21.173 | 21.274 |
| 93.83599851245818 | -1.09 | 1.465 | 20.855 | 20.95 |
| 94.00334696913353 | -1.065 | 1.375 | 20.721 | 20.812 |
| 94.17069542580886 | -1.035 | 1.315 | 20.686 | 20.772 |
| 94.3380438824842 | -1.012 | 1.255 | 20.725 | 20.805 |
| 94.50539233915954 | -0.99 | 1.208 | 20.893 | 20.968 |
| 94.66344365935292 | -0.954 | 1.169 | 21.129 | 21.197 |
| 94.83079211602828 | -0.906 | 1.206 | 21.435 | 21.505 |
| 94.99814057270362 | -0.858 | 1.272 | 21.716 | 21.79 |
| 95.16548902937897 | -0.804 | 1.302 | 21.871 | 21.945 |
| 95.33283748605432 | -0.781 | 1.334 | 21.884 | 21.959 |
| 95.50018594272963 | -0.763 | 1.334 | 21.867 | 21.942 |
| 95.66753439940499 | -0.777 | 1.31 | 21.711 | 21.785 |
| 95.83488285608034 | -0.803 | 1.234 | 21.511 | 21.581 |
| 96.00223131275567 | -0.822 | 1.143 | 21.462 | 21.526 |
| 96.16957976943102 | -0.839 | 1.039 | 21.626 | 21.684 |
| 96.33692822610638 | -0.861 | 0.942 | 21.868 | 21.921 |
| 96.50427668278171 | -0.875 | 0.915 | 22.234 | 22.284 |
| 96.67162513945706 | -0.884 | 0.93 | 22.719 | 22.768 |
| 96.8389735961324 | -0.884 | 0.929 | 23.133 | 23.182 |
| 96.99702491632577 | -0.879 | 0.93 | 23.441 | 23.489 |
| 97.16437337300111 | -0.855 | 0.933 | 23.671 | 23.717 |
| 97.33172182967647 | -0.822 | 0.917 | 23.781 | 23.826 |
| 97.49907028635181 | -0.8 | 0.928 | 23.907 | 23.95 |
| 97.66641874302715 | -0.777 | 0.943 | 24.022 | 24.065 |
| 97.8337671997025 | -0.75 | 0.969 | 24.111 | 24.155 |
| 98.00111565637785 | -0.726 | 1.012 | 24.089 | 24.134 |
| 98.16846411305319 | -0.703 | 1.01 | 23.99 | 24.034 |
| 98.33581256972855 | -0.67 | 1.08 | 23.874 | 23.921 |
| 98.50316102640389 | -0.64 | 1.143 | 23.686 | 23.737 |
| 98.67050948307921 | -0.619 | 1.155 | 23.499 | 23.551 |
| 98.83785793975456 | -0.601 | 1.143 | 23.494 | 23.546 |
| 99.0052063964299 | -0.574 | 1.141 | 23.552 | 23.605 |
| 99.17255485310525 | -0.525 | 1.206 | 23.755 | 23.814 |
| 99.33060617329863 | -0.483 | 1.262 | 23.991 | 24.054 |
| 99.49795462997399 | -0.445 | 1.334 | 24.043 | 24.111 |
| 99.66530308664933 | -0.417 | 1.431 | 23.901 | 23.974 |
| 99.83265154332467 | -0.397 | 1.507 | 23.755 | 23.832 |
| 100.0 | -0.359 | 1.597 | 23.694 | 23.782 |